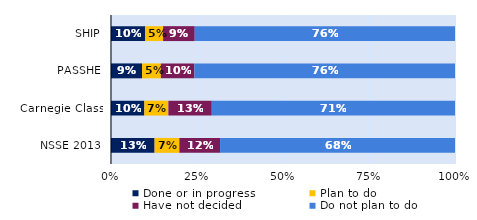
| Category | Done or in progress | Plan to do | Have not decided | Do not plan to do |
|---|---|---|---|---|
| SHIP | 0.1 | 0.052 | 0.092 | 0.757 |
| PASSHE | 0.09 | 0.055 | 0.098 | 0.758 |
| Carnegie Class | 0.097 | 0.07 | 0.126 | 0.707 |
| NSSE 2013 | 0.127 | 0.072 | 0.118 | 0.683 |